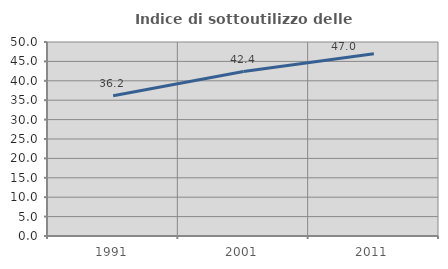
| Category | Indice di sottoutilizzo delle abitazioni  |
|---|---|
| 1991.0 | 36.171 |
| 2001.0 | 42.39 |
| 2011.0 | 46.974 |